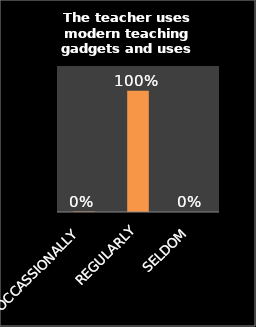
| Category | Series 0 |
|---|---|
| OCCASSIONALLY | 0.004 |
| REGULARLY | 0.996 |
| SELDOM | 0 |